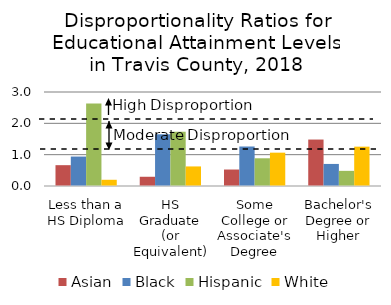
| Category | Asian | Black | Hispanic | White |
|---|---|---|---|---|
| Less than a HS Diploma | 0.665 | 0.94 | 2.635 | 0.199 |
| HS Graduate (or Equivalent) | 0.295 | 1.65 | 1.732 | 0.624 |
| Some College or Associate's Degree | 0.526 | 1.261 | 0.885 | 1.064 |
| Bachelor's Degree or Higher | 1.482 | 0.704 | 0.483 | 1.255 |